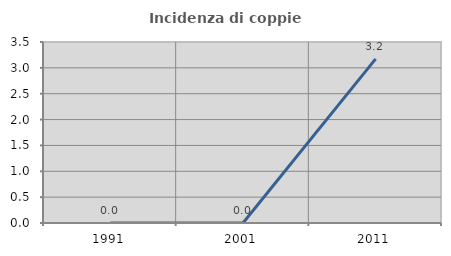
| Category | Incidenza di coppie miste |
|---|---|
| 1991.0 | 0 |
| 2001.0 | 0 |
| 2011.0 | 3.175 |